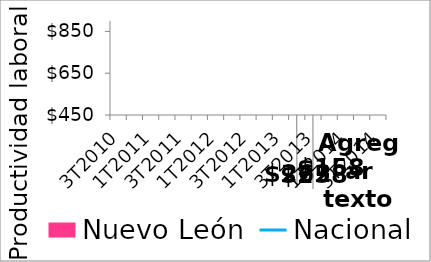
| Category | Nuevo León |
|---|---|
| 3T2010 | 248.253 |
| 4T2010 | 239.397 |
| 1T2011 | 247.378 |
| 2T2011 | 247.683 |
| 3T2011 | 253.51 |
| 4T2011 | 251.081 |
| 1T2012 | 258.383 |
| 2T2012 | 258.448 |
| 3T2012 | 256.055 |
| 4T2012 | 248.716 |
| 1T2013 | 275.613 |
| 2T2013 | 261.773 |
| 3T2013 | 257.714 |
| 4T2013 | 252.005 |
| 1T2014 | 276.195 |
| 2T2014 | 271.32 |
| 3T2014 | 269.967 |